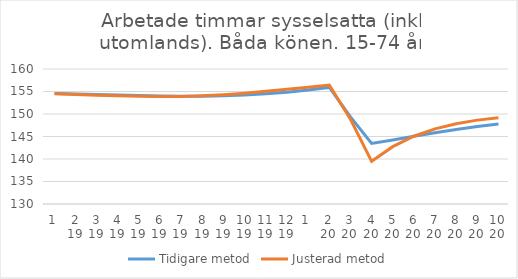
| Category | Tidigare metod | Justerad metod |
|---|---|---|
| 0 | 154.54 | 154.5 |
| 1 | 154.47 | 154.35 |
| 2 | 154.36 | 154.19 |
| 3 | 154.23 | 154.04 |
| 4 | 154.09 | 153.92 |
| 5 | 153.99 | 153.87 |
| 6 | 153.95 | 153.91 |
| 7 | 153.97 | 154.06 |
| 8 | 154.06 | 154.3 |
| 9 | 154.23 | 154.63 |
| 10 | 154.48 | 155.03 |
| 11 | 154.84 | 155.48 |
| 12 | 155.32 | 155.95 |
| 13 | 155.91 | 156.42 |
| 14 | 149.34 | 148.84 |
| 15 | 143.45 | 139.48 |
| 16 | 144.24 | 142.74 |
| 17 | 145.05 | 145.06 |
| 18 | 145.84 | 146.7 |
| 19 | 146.57 | 147.84 |
| 20 | 147.22 | 148.64 |
| 21 | 147.77 | 149.19 |